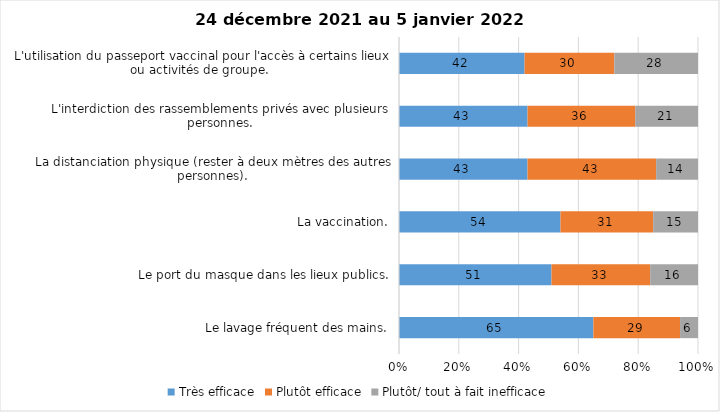
| Category | Très efficace | Plutôt efficace | Plutôt/ tout à fait inefficace |
|---|---|---|---|
| Le lavage fréquent des mains. | 65 | 29 | 6 |
| Le port du masque dans les lieux publics. | 51 | 33 | 16 |
| La vaccination. | 54 | 31 | 15 |
| La distanciation physique (rester à deux mètres des autres personnes). | 43 | 43 | 14 |
| L'interdiction des rassemblements privés avec plusieurs personnes. | 43 | 36 | 21 |
| L'utilisation du passeport vaccinal pour l'accès à certains lieux ou activités de groupe.  | 42 | 30 | 28 |